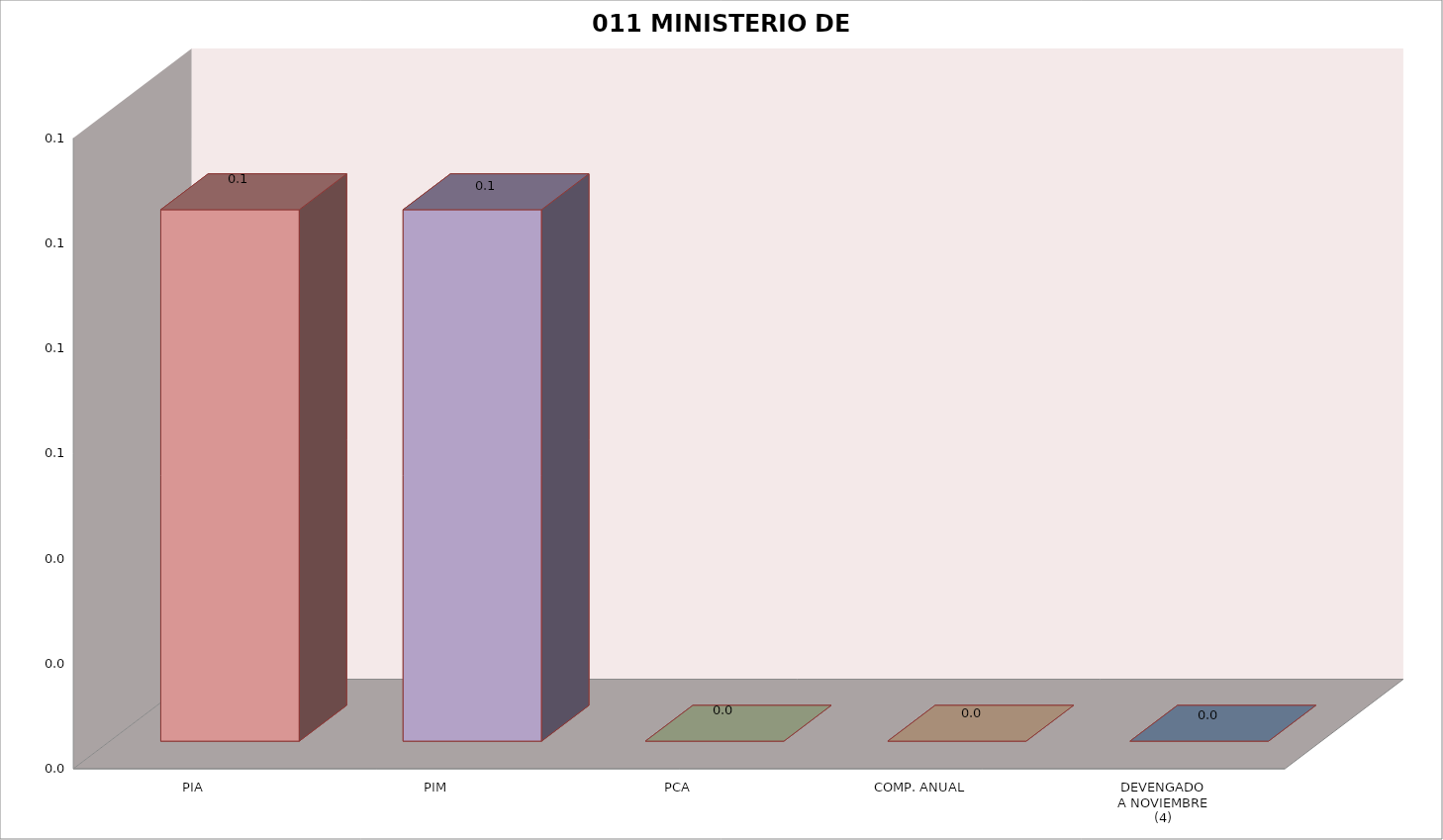
| Category | 011 MINISTERIO DE SALUD |
|---|---|
| PIA | 0.101 |
| PIM | 0.101 |
| PCA | 0 |
| COMP. ANUAL | 0 |
| DEVENGADO
A NOVIEMBRE
(4) | 0 |